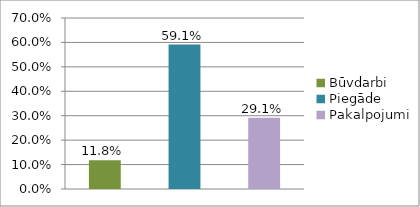
| Category | Series 0 |
|---|---|
| Būvdarbi | 0.118 |
| Piegāde | 0.591 |
| Pakalpojumi | 0.291 |